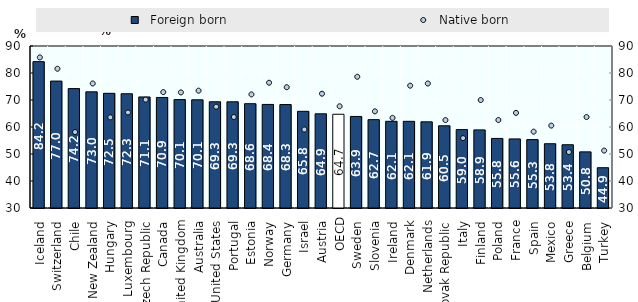
| Category |   Foreign born |
|---|---|
| Iceland  | 84.207 |
| Switzerland  | 77.009 |
| Chile  | 74.221 |
| New Zealand  | 73.022 |
| Hungary  | 72.477 |
| Luxembourg  | 72.311 |
| Czech Republic  | 71.129 |
| Canada  | 70.942 |
| United Kingdom  | 70.146 |
| Australia  | 70.072 |
| United States  | 69.343 |
| Portugal  | 69.335 |
| Estonia  | 68.634 |
| Norway  | 68.357 |
| Germany  | 68.317 |
| Israel  | 65.806 |
| Austria  | 64.883 |
| OECD | 64.719 |
| Sweden  | 63.908 |
| Slovenia  | 62.725 |
| Ireland  | 62.105 |
| Denmark  | 62.1 |
| Netherlands  | 61.912 |
| Slovak Republic  | 60.455 |
| Italy  | 59.041 |
| Finland  | 58.931 |
| Poland  | 55.769 |
| France  | 55.583 |
| Spain  | 55.328 |
| Mexico  | 53.806 |
| Greece  | 53.432 |
| Belgium  | 50.794 |
| Turkey  | 44.92 |